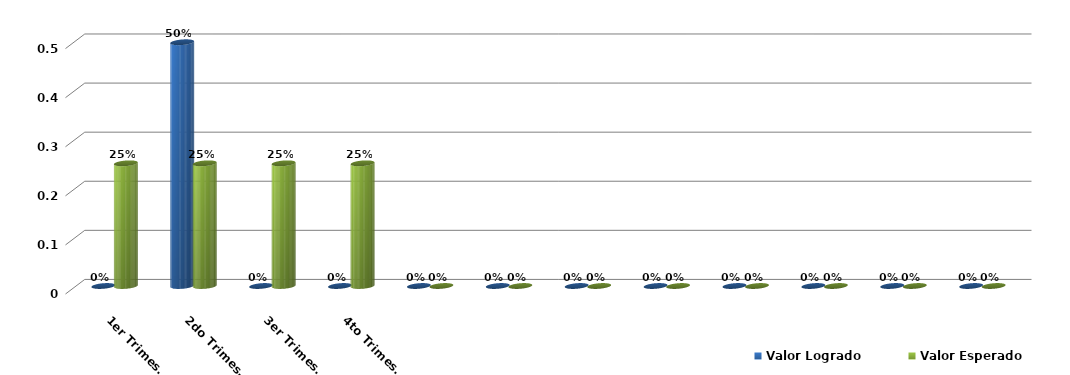
| Category | Valor Logrado | Valor Esperado |
|---|---|---|
| 1er Trimestre | 0 | 0.25 |
| 2do Trimestre | 0.497 | 0.25 |
| 3er Trimestre | 0 | 0.25 |
| 4to Trimestre | 0 | 0.25 |